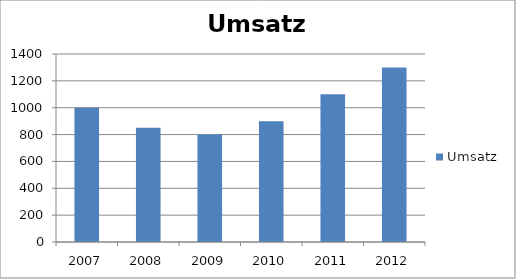
| Category | Umsatz |
|---|---|
| 2007.0 | 1000 |
| 2008.0 | 850 |
| 2009.0 | 800 |
| 2010.0 | 900 |
| 2011.0 | 1100 |
| 2012.0 | 1300 |